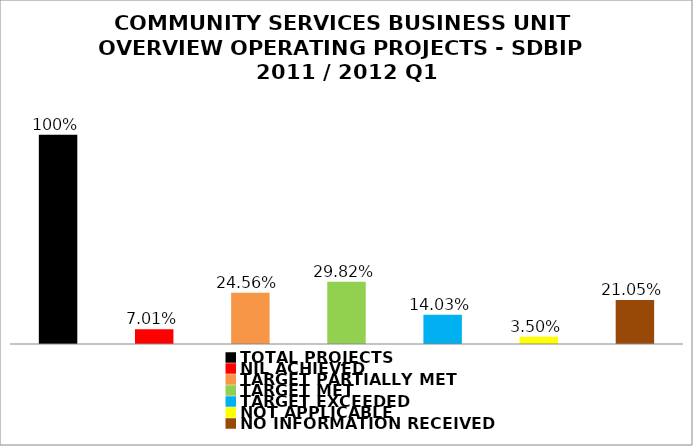
| Category | Series 0 |
|---|---|
| TOTAL PROJECTS | 1 |
| NIL ACHIEVED | 0.07 |
| TARGET PARTIALLY MET | 0.246 |
| TARGET MET | 0.298 |
| TARGET EXCEEDED | 0.14 |
| NOT APPLICABLE | 0.035 |
| NO INFORMATION RECEIVED | 0.21 |